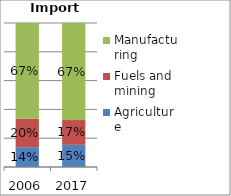
| Category | Agriculture | Fuels and mining | Manufacturing |
|---|---|---|---|
| 2006.0 | 0.138 | 0.197 | 0.665 |
| 2017.0 | 0.154 | 0.172 | 0.674 |